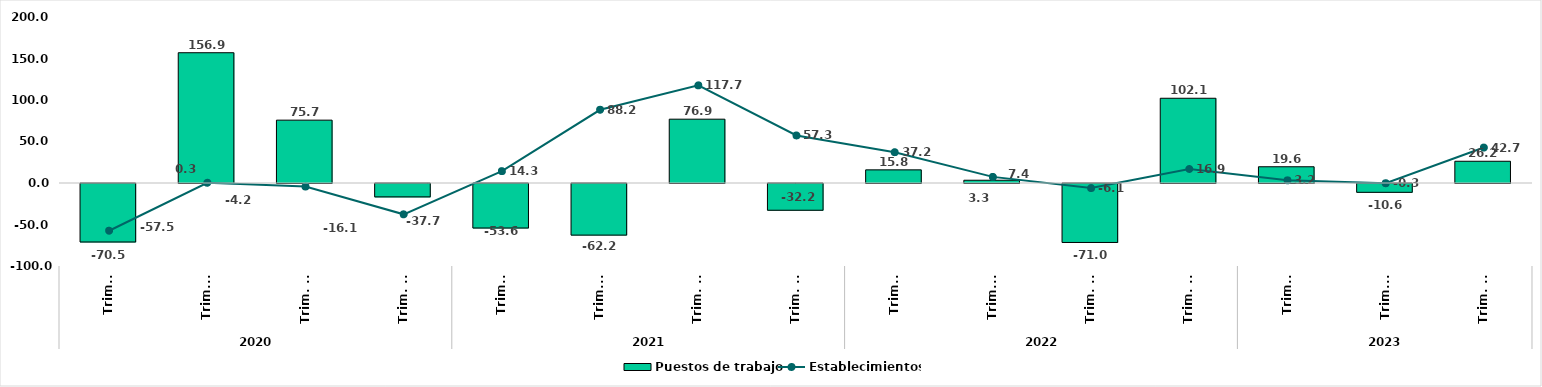
| Category | Puestos de trabajo |
|---|---|
| 0 | -70.484 |
| 1 | 156.947 |
| 2 | 75.721 |
| 3 | -16.124 |
| 4 | -53.641 |
| 5 | -62.186 |
| 6 | 76.897 |
| 7 | -32.233 |
| 8 | 15.827 |
| 9 | 3.323 |
| 10 | -71.031 |
| 11 | 102.101 |
| 12 | 19.565 |
| 13 | -10.624 |
| 14 | 26.188 |